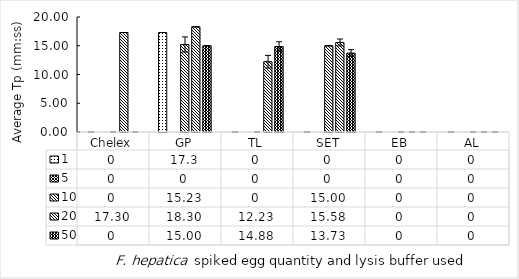
| Category | 1 | 5 | 10 | 20 | 50 |
|---|---|---|---|---|---|
| Chelex | 0 | 0 | 0 | 17.3 | 0 |
| GP | 17.3 | 0 | 15.225 | 18.3 | 15 |
| TL | 0 | 0 | 0 | 12.225 | 14.875 |
| SET | 0 | 0 | 15 | 15.575 | 13.725 |
| EB | 0 | 0 | 0 | 0 | 0 |
| AL | 0 | 0 | 0 | 0 | 0 |